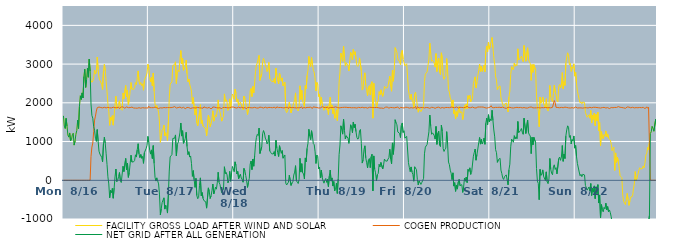
| Category | FACILITY GROSS LOAD AFTER WIND AND SOLAR | COGEN PRODUCTION | NET GRID AFTER ALL GENERATION |
|---|---|---|---|
|  Mon  8/16 | 1664 | 0 | 1664 |
|  Mon  8/16 | 1398 | 0 | 1398 |
|  Mon  8/16 | 1337 | 0 | 1337 |
|  Mon  8/16 | 1599 | 0 | 1599 |
|  Mon  8/16 | 1396 | 0 | 1396 |
|  Mon  8/16 | 1169 | 0 | 1169 |
|  Mon  8/16 | 1114 | 0 | 1114 |
|  Mon  8/16 | 1222 | 0 | 1222 |
|  Mon  8/16 | 1016 | 0 | 1016 |
|  Mon  8/16 | 1046 | 0 | 1046 |
|  Mon  8/16 | 1175 | 0 | 1175 |
|  Mon  8/16 | 1215 | 0 | 1215 |
|  Mon  8/16 | 908 | 0 | 908 |
|  Mon  8/16 | 1007 | 0 | 1007 |
|  Mon  8/16 | 1186 | 0 | 1186 |
|  Mon  8/16 | 1287 | 0 | 1287 |
|  Mon  8/16 | 1552 | 0 | 1552 |
|  Mon  8/16 | 1337 | 0 | 1337 |
|  Mon  8/16 | 1908 | 0 | 1908 |
|  Mon  8/16 | 2182 | 0 | 2182 |
|  Mon  8/16 | 2086 | 0 | 2086 |
|  Mon  8/16 | 2256 | 0 | 2256 |
|  Mon  8/16 | 2125 | 0 | 2125 |
|  Mon  8/16 | 2680 | 0 | 2680 |
|  Mon  8/16 | 2868 | 0 | 2868 |
|  Mon  8/16 | 2398 | 0 | 2398 |
|  Mon  8/16 | 2599 | 0 | 2599 |
|  Mon  8/16 | 2892 | 0 | 2892 |
|  Mon  8/16 | 2661 | 0 | 2661 |
|  Mon  8/16 | 3129 | 0 | 3129 |
|  Mon  8/16 | 2819 | 0 | 2819 |
|  Mon  8/16 | 2579 | 612 | 1967 |
|  Mon  8/16 | 2531 | 856 | 1675 |
|  Mon  8/16 | 2564 | 961 | 1603 |
|  Mon  8/16 | 2641 | 1258 | 1383 |
|  Mon  8/16 | 2846 | 1554 | 1292 |
|  Mon  8/16 | 2742 | 1656 | 1086 |
|  Mon  8/16 | 2792 | 1788 | 1004 |
|  Mon  8/16 | 3183 | 1874 | 1309 |
|  Mon  8/16 | 2863 | 1854 | 1009 |
|  Mon  8/16 | 2642 | 1891 | 751 |
|  Mon  8/16 | 2581 | 1903 | 678 |
|  Mon  8/16 | 2533 | 1878 | 655 |
|  Mon  8/16 | 2472 | 1879 | 593 |
|  Mon  8/16 | 2344 | 1869 | 475 |
|  Mon  8/16 | 2815 | 1876 | 939 |
|  Mon  8/16 | 2995 | 1884 | 1111 |
|  Mon  8/16 | 2829 | 1875 | 954 |
|  Mon  8/16 | 2552 | 1868 | 684 |
|  Mon  8/16 | 2295 | 1886 | 409 |
|  Mon  8/16 | 1973 | 1884 | 89 |
|  Mon  8/16 | 1780 | 1875 | -95 |
|  Mon  8/16 | 1418 | 1871 | -453 |
|  Mon  8/16 | 1626 | 1887 | -261 |
|  Mon  8/16 | 1552 | 1869 | -317 |
|  Mon  8/16 | 1668 | 1877 | -209 |
|  Mon  8/16 | 1423 | 1887 | -464 |
|  Mon  8/16 | 1684 | 1886 | -202 |
|  Mon  8/16 | 1960 | 1873 | 87 |
|  Mon  8/16 | 2172 | 1881 | 291 |
|  Mon  8/16 | 1839 | 1875 | -36 |
|  Mon  8/16 | 1879 | 1882 | -3 |
|  Mon  8/16 | 1985 | 1889 | 96 |
|  Mon  8/16 | 2052 | 1852 | 200 |
|  Mon  8/16 | 1866 | 1874 | -8 |
|  Mon  8/16 | 1834 | 1892 | -58 |
|  Mon  8/16 | 1807 | 1867 | -60 |
|  Mon  8/16 | 2255 | 1893 | 362 |
|  Mon  8/16 | 2099 | 1875 | 224 |
|  Mon  8/16 | 2083 | 1861 | 222 |
|  Mon  8/16 | 2445 | 1883 | 562 |
|  Mon  8/16 | 2159 | 1893 | 266 |
|  Mon  8/16 | 2320 | 1877 | 443 |
|  Mon  8/16 | 1950 | 1875 | 75 |
|  Mon  8/16 | 2085 | 1885 | 200 |
|  Mon  8/16 | 2298 | 1876 | 422 |
|  Mon  8/16 | 2523 | 1876 | 647 |
|  Mon  8/16 | 2360 | 1889 | 471 |
|  Mon  8/16 | 2331 | 1872 | 459 |
|  Mon  8/16 | 2345 | 1866 | 479 |
|  Mon  8/16 | 2389 | 1880 | 509 |
|  Mon  8/16 | 2522 | 1864 | 658 |
|  Mon  8/16 | 2469 | 1870 | 599 |
|  Mon  8/16 | 2651 | 1861 | 790 |
|  Mon  8/16 | 2824 | 1880 | 944 |
|  Mon  8/16 | 2554 | 1874 | 680 |
|  Mon  8/16 | 2472 | 1888 | 584 |
|  Mon  8/16 | 2526 | 1861 | 665 |
|  Mon  8/16 | 2445 | 1878 | 567 |
|  Mon  8/16 | 2491 | 1875 | 616 |
|  Mon  8/16 | 2326 | 1889 | 437 |
|  Mon  8/16 | 2580 | 1868 | 712 |
|  Mon  8/16 | 2565 | 1874 | 691 |
|  Mon  8/16 | 2692 | 1868 | 824 |
|  Mon  8/16 | 2769 | 1865 | 904 |
|  Mon  8/16 | 2998 | 1865 | 1133 |
|  Tue  8/17 | 2894 | 1912 | 982 |
|  Tue  8/17 | 2650 | 1875 | 775 |
|  Tue  8/17 | 2542 | 1866 | 676 |
|  Tue  8/17 | 2659 | 1875 | 784 |
|  Tue  8/17 | 2440 | 1879 | 561 |
|  Tue  8/17 | 2770 | 1874 | 896 |
|  Tue  8/17 | 2305 | 1871 | 434 |
|  Tue  8/17 | 1965 | 1890 | 75 |
|  Tue  8/17 | 1862 | 1882 | -20 |
|  Tue  8/17 | 1935 | 1872 | 63 |
|  Tue  8/17 | 1952 | 1868 | 84 |
|  Tue  8/17 | 1759 | 1853 | -94 |
|  Tue  8/17 | 1506 | 1864 | -358 |
|  Tue  8/17 | 980 | 1872 | -892 |
|  Tue  8/17 | 1140 | 1872 | -732 |
|  Tue  8/17 | 1293 | 1866 | -573 |
|  Tue  8/17 | 1331 | 1883 | -552 |
|  Tue  8/17 | 1425 | 1878 | -453 |
|  Tue  8/17 | 1145 | 1889 | -744 |
|  Tue  8/17 | 1230 | 1873 | -643 |
|  Tue  8/17 | 1180 | 1883 | -703 |
|  Tue  8/17 | 1030 | 1877 | -847 |
|  Tue  8/17 | 1502 | 1873 | -371 |
|  Tue  8/17 | 2115 | 1877 | 238 |
|  Tue  8/17 | 2484 | 1880 | 604 |
|  Tue  8/17 | 2508 | 1876 | 632 |
|  Tue  8/17 | 2540 | 1875 | 665 |
|  Tue  8/17 | 2964 | 1883 | 1081 |
|  Tue  8/17 | 2959 | 1867 | 1092 |
|  Tue  8/17 | 2988 | 1902 | 1086 |
|  Tue  8/17 | 3058 | 1887 | 1171 |
|  Tue  8/17 | 2496 | 1867 | 629 |
|  Tue  8/17 | 2811 | 1882 | 929 |
|  Tue  8/17 | 2846 | 1876 | 970 |
|  Tue  8/17 | 2801 | 1853 | 948 |
|  Tue  8/17 | 3113 | 1890 | 1223 |
|  Tue  8/17 | 3349 | 1870 | 1479 |
|  Tue  8/17 | 3006 | 1865 | 1141 |
|  Tue  8/17 | 3148 | 1868 | 1280 |
|  Tue  8/17 | 2839 | 1884 | 955 |
|  Tue  8/17 | 2873 | 1868 | 1005 |
|  Tue  8/17 | 2929 | 1849 | 1080 |
|  Tue  8/17 | 3102 | 1863 | 1239 |
|  Tue  8/17 | 2752 | 1881 | 871 |
|  Tue  8/17 | 2546 | 1882 | 664 |
|  Tue  8/17 | 2613 | 1876 | 737 |
|  Tue  8/17 | 2478 | 1879 | 599 |
|  Tue  8/17 | 2483 | 1855 | 628 |
|  Tue  8/17 | 2305 | 1874 | 431 |
|  Tue  8/17 | 1971 | 1870 | 101 |
|  Tue  8/17 | 2137 | 1887 | 250 |
|  Tue  8/17 | 1881 | 1871 | 10 |
|  Tue  8/17 | 1684 | 1867 | -183 |
|  Tue  8/17 | 1916 | 1867 | 49 |
|  Tue  8/17 | 1484 | 1878 | -394 |
|  Tue  8/17 | 1405 | 1882 | -477 |
|  Tue  8/17 | 1423 | 1871 | -448 |
|  Tue  8/17 | 1741 | 1871 | -130 |
|  Tue  8/17 | 1953 | 1891 | 62 |
|  Tue  8/17 | 1468 | 1867 | -399 |
|  Tue  8/17 | 1556 | 1873 | -317 |
|  Tue  8/17 | 1393 | 1862 | -469 |
|  Tue  8/17 | 1369 | 1895 | -526 |
|  Tue  8/17 | 1360 | 1882 | -522 |
|  Tue  8/17 | 1320 | 1875 | -555 |
|  Tue  8/17 | 1148 | 1868 | -720 |
|  Tue  8/17 | 1136 | 1866 | -730 |
|  Tue  8/17 | 1678 | 1874 | -196 |
|  Tue  8/17 | 1590 | 1883 | -293 |
|  Tue  8/17 | 1381 | 1852 | -471 |
|  Tue  8/17 | 1467 | 1872 | -405 |
|  Tue  8/17 | 1585 | 1855 | -270 |
|  Tue  8/17 | 1795 | 1892 | -97 |
|  Tue  8/17 | 1526 | 1880 | -354 |
|  Tue  8/17 | 1608 | 1887 | -279 |
|  Tue  8/17 | 1690 | 1868 | -178 |
|  Tue  8/17 | 1645 | 1875 | -230 |
|  Tue  8/17 | 1808 | 1875 | -67 |
|  Tue  8/17 | 2075 | 1868 | 207 |
|  Tue  8/17 | 1824 | 1877 | -53 |
|  Tue  8/17 | 1767 | 1873 | -106 |
|  Tue  8/17 | 1652 | 1875 | -223 |
|  Tue  8/17 | 1527 | 1849 | -322 |
|  Tue  8/17 | 1612 | 1877 | -265 |
|  Tue  8/17 | 1642 | 1879 | -237 |
|  Tue  8/17 | 2230 | 1881 | 349 |
|  Tue  8/17 | 2040 | 1869 | 171 |
|  Tue  8/17 | 2080 | 1877 | 203 |
|  Tue  8/17 | 2015 | 1877 | 138 |
|  Tue  8/17 | 1805 | 1869 | -64 |
|  Tue  8/17 | 1861 | 1870 | -9 |
|  Tue  8/17 | 2102 | 1873 | 229 |
|  Tue  8/17 | 1856 | 1881 | -25 |
|  Tue  8/17 | 2081 | 1890 | 191 |
|  Tue  8/17 | 2228 | 1871 | 357 |
|  Tue  8/17 | 2194 | 1892 | 302 |
|  Wed  8/18 | 2092 | 1869 | 223 |
|  Wed  8/18 | 2350 | 1874 | 476 |
|  Wed  8/18 | 2257 | 1872 | 385 |
|  Wed  8/18 | 2027 | 1865 | 162 |
|  Wed  8/18 | 2100 | 1872 | 228 |
|  Wed  8/18 | 1929 | 1890 | 39 |
|  Wed  8/18 | 1925 | 1884 | 41 |
|  Wed  8/18 | 2020 | 1865 | 155 |
|  Wed  8/18 | 1945 | 1891 | 54 |
|  Wed  8/18 | 1904 | 1885 | 19 |
|  Wed  8/18 | 1818 | 1868 | -50 |
|  Wed  8/18 | 2174 | 1868 | 306 |
|  Wed  8/18 | 2121 | 1875 | 246 |
|  Wed  8/18 | 2008 | 1886 | 122 |
|  Wed  8/18 | 1843 | 1849 | -6 |
|  Wed  8/18 | 1697 | 1881 | -184 |
|  Wed  8/18 | 1839 | 1892 | -53 |
|  Wed  8/18 | 1928 | 1878 | 50 |
|  Wed  8/18 | 2309 | 1894 | 415 |
|  Wed  8/18 | 2370 | 1872 | 498 |
|  Wed  8/18 | 2162 | 1887 | 275 |
|  Wed  8/18 | 2420 | 1871 | 549 |
|  Wed  8/18 | 2255 | 1892 | 363 |
|  Wed  8/18 | 2510 | 1883 | 627 |
|  Wed  8/18 | 2807 | 1876 | 931 |
|  Wed  8/18 | 2974 | 1868 | 1106 |
|  Wed  8/18 | 3030 | 1845 | 1185 |
|  Wed  8/18 | 3021 | 1865 | 1156 |
|  Wed  8/18 | 3225 | 1878 | 1347 |
|  Wed  8/18 | 2580 | 1889 | 691 |
|  Wed  8/18 | 2576 | 1888 | 688 |
|  Wed  8/18 | 2745 | 1880 | 865 |
|  Wed  8/18 | 3061 | 1863 | 1198 |
|  Wed  8/18 | 3149 | 1865 | 1284 |
|  Wed  8/18 | 3085 | 1864 | 1221 |
|  Wed  8/18 | 2976 | 1887 | 1089 |
|  Wed  8/18 | 2908 | 1868 | 1040 |
|  Wed  8/18 | 2805 | 1867 | 938 |
|  Wed  8/18 | 2867 | 1876 | 991 |
|  Wed  8/18 | 3045 | 1882 | 1163 |
|  Wed  8/18 | 2625 | 1866 | 759 |
|  Wed  8/18 | 2600 | 1878 | 722 |
|  Wed  8/18 | 2556 | 1870 | 686 |
|  Wed  8/18 | 2555 | 1873 | 682 |
|  Wed  8/18 | 2542 | 1864 | 678 |
|  Wed  8/18 | 2630 | 1886 | 744 |
|  Wed  8/18 | 2505 | 1880 | 625 |
|  Wed  8/18 | 2894 | 1860 | 1034 |
|  Wed  8/18 | 2722 | 1895 | 827 |
|  Wed  8/18 | 2591 | 1880 | 711 |
|  Wed  8/18 | 2489 | 1876 | 613 |
|  Wed  8/18 | 2768 | 1876 | 892 |
|  Wed  8/18 | 2668 | 1880 | 788 |
|  Wed  8/18 | 2559 | 1865 | 694 |
|  Wed  8/18 | 2644 | 1875 | 769 |
|  Wed  8/18 | 2438 | 1869 | 569 |
|  Wed  8/18 | 2436 | 1868 | 568 |
|  Wed  8/18 | 2532 | 1879 | 653 |
|  Wed  8/18 | 1809 | 1881 | -72 |
|  Wed  8/18 | 1747 | 1869 | -122 |
|  Wed  8/18 | 1787 | 1887 | -100 |
|  Wed  8/18 | 1799 | 1850 | -51 |
|  Wed  8/18 | 2018 | 1889 | 129 |
|  Wed  8/18 | 1997 | 1885 | 112 |
|  Wed  8/18 | 1743 | 1875 | -132 |
|  Wed  8/18 | 1823 | 1891 | -68 |
|  Wed  8/18 | 1839 | 1878 | -39 |
|  Wed  8/18 | 2001 | 1866 | 135 |
|  Wed  8/18 | 2083 | 1873 | 210 |
|  Wed  8/18 | 2256 | 1879 | 377 |
|  Wed  8/18 | 1860 | 1869 | -9 |
|  Wed  8/18 | 1817 | 1867 | -50 |
|  Wed  8/18 | 1789 | 1873 | -84 |
|  Wed  8/18 | 1893 | 1874 | 19 |
|  Wed  8/18 | 2440 | 1873 | 567 |
|  Wed  8/18 | 2086 | 1875 | 211 |
|  Wed  8/18 | 2324 | 1895 | 429 |
|  Wed  8/18 | 2045 | 1849 | 196 |
|  Wed  8/18 | 2044 | 1882 | 162 |
|  Wed  8/18 | 1898 | 1865 | 33 |
|  Wed  8/18 | 2446 | 1869 | 577 |
|  Wed  8/18 | 2361 | 1882 | 479 |
|  Wed  8/18 | 2705 | 1881 | 824 |
|  Wed  8/18 | 2837 | 1881 | 956 |
|  Wed  8/18 | 3198 | 1882 | 1316 |
|  Wed  8/18 | 3006 | 1867 | 1139 |
|  Wed  8/18 | 2936 | 1887 | 1049 |
|  Wed  8/18 | 3168 | 1889 | 1279 |
|  Wed  8/18 | 3000 | 1856 | 1144 |
|  Wed  8/18 | 2841 | 1896 | 945 |
|  Wed  8/18 | 2791 | 1873 | 918 |
|  Wed  8/18 | 2620 | 1885 | 735 |
|  Wed  8/18 | 2306 | 1872 | 434 |
|  Wed  8/18 | 2530 | 1879 | 651 |
|  Wed  8/18 | 2487 | 1875 | 612 |
|  Wed  8/18 | 2162 | 1867 | 295 |
|  Thu  8/19 | 2221 | 1878 | 343 |
|  Thu  8/19 | 1934 | 1870 | 64 |
|  Thu  8/19 | 2144 | 1882 | 262 |
|  Thu  8/19 | 1965 | 1897 | 68 |
|  Thu  8/19 | 1874 | 1889 | -15 |
|  Thu  8/19 | 1807 | 1882 | -75 |
|  Thu  8/19 | 1885 | 1882 | 3 |
|  Thu  8/19 | 1922 | 1876 | 46 |
|  Thu  8/19 | 1818 | 1870 | -52 |
|  Thu  8/19 | 1913 | 1887 | 26 |
|  Thu  8/19 | 1695 | 1860 | -165 |
|  Thu  8/19 | 1982 | 1874 | 108 |
|  Thu  8/19 | 2146 | 1881 | 265 |
|  Thu  8/19 | 1838 | 1858 | -20 |
|  Thu  8/19 | 1941 | 1880 | 61 |
|  Thu  8/19 | 1720 | 1869 | -149 |
|  Thu  8/19 | 1851 | 1882 | -31 |
|  Thu  8/19 | 1600 | 1877 | -277 |
|  Thu  8/19 | 1662 | 1895 | -233 |
|  Thu  8/19 | 1816 | 1891 | -75 |
|  Thu  8/19 | 1541 | 1881 | -340 |
|  Thu  8/19 | 1903 | 1869 | 34 |
|  Thu  8/19 | 2533 | 1868 | 665 |
|  Thu  8/19 | 2805 | 1892 | 913 |
|  Thu  8/19 | 3283 | 1877 | 1406 |
|  Thu  8/19 | 3175 | 1865 | 1310 |
|  Thu  8/19 | 3072 | 1881 | 1191 |
|  Thu  8/19 | 3461 | 1884 | 1577 |
|  Thu  8/19 | 3175 | 1884 | 1291 |
|  Thu  8/19 | 2947 | 1881 | 1066 |
|  Thu  8/19 | 3034 | 1884 | 1150 |
|  Thu  8/19 | 3009 | 1865 | 1144 |
|  Thu  8/19 | 2960 | 1876 | 1084 |
|  Thu  8/19 | 2827 | 1874 | 953 |
|  Thu  8/19 | 3089 | 1879 | 1210 |
|  Thu  8/19 | 3304 | 1871 | 1433 |
|  Thu  8/19 | 3230 | 1872 | 1358 |
|  Thu  8/19 | 3111 | 1884 | 1227 |
|  Thu  8/19 | 3379 | 1874 | 1505 |
|  Thu  8/19 | 3250 | 1891 | 1359 |
|  Thu  8/19 | 3318 | 1873 | 1445 |
|  Thu  8/19 | 3135 | 1879 | 1256 |
|  Thu  8/19 | 2971 | 1865 | 1106 |
|  Thu  8/19 | 2940 | 1879 | 1061 |
|  Thu  8/19 | 2974 | 1883 | 1091 |
|  Thu  8/19 | 3160 | 1879 | 1281 |
|  Thu  8/19 | 3185 | 1873 | 1312 |
|  Thu  8/19 | 2829 | 1876 | 953 |
|  Thu  8/19 | 2329 | 1885 | 444 |
|  Thu  8/19 | 2399 | 1871 | 528 |
|  Thu  8/19 | 2668 | 1870 | 798 |
|  Thu  8/19 | 2775 | 1885 | 890 |
|  Thu  8/19 | 2457 | 1878 | 579 |
|  Thu  8/19 | 2325 | 1874 | 451 |
|  Thu  8/19 | 2180 | 1863 | 317 |
|  Thu  8/19 | 2400 | 1881 | 519 |
|  Thu  8/19 | 2446 | 1884 | 562 |
|  Thu  8/19 | 2200 | 1874 | 326 |
|  Thu  8/19 | 2488 | 1882 | 606 |
|  Thu  8/19 | 2546 | 1873 | 673 |
|  Thu  8/19 | 1604 | 1877 | -273 |
|  Thu  8/19 | 2502 | 1873 | 629 |
|  Thu  8/19 | 2163 | 1877 | 286 |
|  Thu  8/19 | 2066 | 1873 | 193 |
|  Thu  8/19 | 1871 | 1880 | -9 |
|  Thu  8/19 | 2016 | 1873 | 143 |
|  Thu  8/19 | 2052 | 1875 | 177 |
|  Thu  8/19 | 2289 | 1880 | 409 |
|  Thu  8/19 | 2210 | 1864 | 346 |
|  Thu  8/19 | 2337 | 1875 | 462 |
|  Thu  8/19 | 2324 | 1865 | 459 |
|  Thu  8/19 | 2168 | 1877 | 291 |
|  Thu  8/19 | 2255 | 1856 | 399 |
|  Thu  8/19 | 2427 | 1878 | 549 |
|  Thu  8/19 | 2387 | 1885 | 502 |
|  Thu  8/19 | 2369 | 1883 | 486 |
|  Thu  8/19 | 2385 | 1892 | 493 |
|  Thu  8/19 | 2437 | 1887 | 550 |
|  Thu  8/19 | 2443 | 1863 | 580 |
|  Thu  8/19 | 2689 | 1887 | 802 |
|  Thu  8/19 | 2426 | 1881 | 545 |
|  Thu  8/19 | 2299 | 1875 | 424 |
|  Thu  8/19 | 2841 | 1876 | 965 |
|  Thu  8/19 | 2557 | 1888 | 669 |
|  Thu  8/19 | 2850 | 1869 | 981 |
|  Thu  8/19 | 3425 | 1861 | 1564 |
|  Thu  8/19 | 3362 | 1880 | 1482 |
|  Thu  8/19 | 3306 | 1872 | 1434 |
|  Thu  8/19 | 3137 | 1889 | 1248 |
|  Thu  8/19 | 3117 | 1866 | 1251 |
|  Thu  8/19 | 3060 | 1849 | 1211 |
|  Thu  8/19 | 2986 | 1883 | 1103 |
|  Thu  8/19 | 3300 | 1882 | 1418 |
|  Thu  8/19 | 3355 | 1875 | 1480 |
|  Thu  8/19 | 3124 | 1891 | 1233 |
|  Thu  8/19 | 3145 | 1866 | 1279 |
|  Fri  8/20 | 2956 | 1869 | 1087 |
|  Fri  8/20 | 2951 | 1887 | 1064 |
|  Fri  8/20 | 3009 | 1875 | 1134 |
|  Fri  8/20 | 3025 | 1881 | 1144 |
|  Fri  8/20 | 2331 | 1876 | 455 |
|  Fri  8/20 | 2191 | 1863 | 328 |
|  Fri  8/20 | 2089 | 1866 | 223 |
|  Fri  8/20 | 2220 | 1876 | 344 |
|  Fri  8/20 | 2076 | 1865 | 211 |
|  Fri  8/20 | 2014 | 1867 | 147 |
|  Fri  8/20 | 1859 | 1884 | -25 |
|  Fri  8/20 | 2227 | 1879 | 348 |
|  Fri  8/20 | 2278 | 1905 | 373 |
|  Fri  8/20 | 2111 | 1837 | 274 |
|  Fri  8/20 | 1914 | 1897 | 17 |
|  Fri  8/20 | 1758 | 1878 | -120 |
|  Fri  8/20 | 1853 | 1868 | -15 |
|  Fri  8/20 | 1835 | 1868 | -33 |
|  Fri  8/20 | 1771 | 1878 | -107 |
|  Fri  8/20 | 1813 | 1869 | -56 |
|  Fri  8/20 | 1872 | 1878 | -6 |
|  Fri  8/20 | 1932 | 1882 | 50 |
|  Fri  8/20 | 2551 | 1868 | 683 |
|  Fri  8/20 | 2740 | 1885 | 855 |
|  Fri  8/20 | 2716 | 1879 | 837 |
|  Fri  8/20 | 2800 | 1873 | 927 |
|  Fri  8/20 | 2969 | 1875 | 1094 |
|  Fri  8/20 | 3131 | 1880 | 1251 |
|  Fri  8/20 | 3542 | 1858 | 1684 |
|  Fri  8/20 | 3274 | 1868 | 1406 |
|  Fri  8/20 | 3071 | 1884 | 1187 |
|  Fri  8/20 | 3099 | 1874 | 1225 |
|  Fri  8/20 | 3073 | 1878 | 1195 |
|  Fri  8/20 | 3025 | 1874 | 1151 |
|  Fri  8/20 | 2922 | 1858 | 1064 |
|  Fri  8/20 | 3271 | 1881 | 1390 |
|  Fri  8/20 | 2808 | 1881 | 927 |
|  Fri  8/20 | 3083 | 1870 | 1213 |
|  Fri  8/20 | 3155 | 1887 | 1268 |
|  Fri  8/20 | 2791 | 1883 | 908 |
|  Fri  8/20 | 2729 | 1862 | 867 |
|  Fri  8/20 | 3291 | 1868 | 1423 |
|  Fri  8/20 | 3145 | 1880 | 1265 |
|  Fri  8/20 | 2691 | 1872 | 819 |
|  Fri  8/20 | 2608 | 1864 | 744 |
|  Fri  8/20 | 2671 | 1875 | 796 |
|  Fri  8/20 | 2709 | 1880 | 829 |
|  Fri  8/20 | 3143 | 1888 | 1255 |
|  Fri  8/20 | 2820 | 1879 | 941 |
|  Fri  8/20 | 2341 | 1871 | 470 |
|  Fri  8/20 | 2279 | 1874 | 405 |
|  Fri  8/20 | 2130 | 1869 | 261 |
|  Fri  8/20 | 2070 | 1889 | 181 |
|  Fri  8/20 | 1891 | 1874 | 17 |
|  Fri  8/20 | 2074 | 1882 | 192 |
|  Fri  8/20 | 1721 | 1871 | -150 |
|  Fri  8/20 | 1811 | 1873 | -62 |
|  Fri  8/20 | 1584 | 1870 | -286 |
|  Fri  8/20 | 1770 | 1892 | -122 |
|  Fri  8/20 | 1650 | 1878 | -228 |
|  Fri  8/20 | 1819 | 1865 | -46 |
|  Fri  8/20 | 1906 | 1884 | 22 |
|  Fri  8/20 | 1742 | 1883 | -141 |
|  Fri  8/20 | 1726 | 1878 | -152 |
|  Fri  8/20 | 1767 | 1880 | -113 |
|  Fri  8/20 | 1567 | 1880 | -313 |
|  Fri  8/20 | 1698 | 1875 | -177 |
|  Fri  8/20 | 1932 | 1880 | 52 |
|  Fri  8/20 | 1859 | 1882 | -23 |
|  Fri  8/20 | 1971 | 1891 | 80 |
|  Fri  8/20 | 1847 | 1907 | -60 |
|  Fri  8/20 | 2184 | 1905 | 279 |
|  Fri  8/20 | 2106 | 1874 | 232 |
|  Fri  8/20 | 2198 | 1876 | 322 |
|  Fri  8/20 | 2025 | 1874 | 151 |
|  Fri  8/20 | 2067 | 1864 | 203 |
|  Fri  8/20 | 2115 | 1891 | 224 |
|  Fri  8/20 | 2501 | 1881 | 620 |
|  Fri  8/20 | 2588 | 1870 | 718 |
|  Fri  8/20 | 2671 | 1864 | 807 |
|  Fri  8/20 | 2384 | 1866 | 518 |
|  Fri  8/20 | 2530 | 1865 | 665 |
|  Fri  8/20 | 2699 | 1891 | 808 |
|  Fri  8/20 | 2837 | 1868 | 969 |
|  Fri  8/20 | 2996 | 1891 | 1105 |
|  Fri  8/20 | 2810 | 1877 | 933 |
|  Fri  8/20 | 2946 | 1891 | 1055 |
|  Fri  8/20 | 2811 | 1875 | 936 |
|  Fri  8/20 | 2881 | 1890 | 991 |
|  Fri  8/20 | 2968 | 1879 | 1089 |
|  Fri  8/20 | 2803 | 1874 | 929 |
|  Fri  8/20 | 3345 | 1871 | 1474 |
|  Fri  8/20 | 3468 | 1864 | 1604 |
|  Fri  8/20 | 3316 | 1879 | 1437 |
|  Fri  8/20 | 3569 | 1876 | 1693 |
|  Fri  8/20 | 3386 | 1880 | 1506 |
|  Sat  8/21 | 3474 | 1891 | 1583 |
|  Sat  8/21 | 3466 | 1925 | 1541 |
|  Sat  8/21 | 3687 | 1879 | 1808 |
|  Sat  8/21 | 3421 | 1875 | 1546 |
|  Sat  8/21 | 3171 | 1873 | 1298 |
|  Sat  8/21 | 2994 | 1873 | 1121 |
|  Sat  8/21 | 2672 | 1882 | 790 |
|  Sat  8/21 | 2588 | 1877 | 711 |
|  Sat  8/21 | 2343 | 1880 | 463 |
|  Sat  8/21 | 2401 | 1874 | 527 |
|  Sat  8/21 | 2409 | 1885 | 524 |
|  Sat  8/21 | 2437 | 1869 | 568 |
|  Sat  8/21 | 2138 | 1876 | 262 |
|  Sat  8/21 | 2048 | 1875 | 173 |
|  Sat  8/21 | 1950 | 1889 | 61 |
|  Sat  8/21 | 1905 | 1883 | 22 |
|  Sat  8/21 | 1960 | 1869 | 91 |
|  Sat  8/21 | 1942 | 1871 | 71 |
|  Sat  8/21 | 1997 | 1857 | 140 |
|  Sat  8/21 | 2018 | 1871 | 147 |
|  Sat  8/21 | 1764 | 1882 | -118 |
|  Sat  8/21 | 2149 | 1879 | 270 |
|  Sat  8/21 | 2300 | 1884 | 416 |
|  Sat  8/21 | 2736 | 1871 | 865 |
|  Sat  8/21 | 2935 | 1871 | 1064 |
|  Sat  8/21 | 2931 | 1886 | 1045 |
|  Sat  8/21 | 2848 | 1866 | 982 |
|  Sat  8/21 | 3027 | 1875 | 1152 |
|  Sat  8/21 | 2944 | 1876 | 1068 |
|  Sat  8/21 | 2993 | 1870 | 1123 |
|  Sat  8/21 | 2958 | 1883 | 1075 |
|  Sat  8/21 | 3395 | 1878 | 1517 |
|  Sat  8/21 | 3106 | 1875 | 1231 |
|  Sat  8/21 | 3133 | 1886 | 1247 |
|  Sat  8/21 | 3164 | 1881 | 1283 |
|  Sat  8/21 | 3204 | 1867 | 1337 |
|  Sat  8/21 | 3109 | 1869 | 1240 |
|  Sat  8/21 | 3063 | 1875 | 1188 |
|  Sat  8/21 | 3480 | 1878 | 1602 |
|  Sat  8/21 | 3490 | 1881 | 1609 |
|  Sat  8/21 | 3075 | 1866 | 1209 |
|  Sat  8/21 | 3057 | 1871 | 1186 |
|  Sat  8/21 | 3420 | 1866 | 1554 |
|  Sat  8/21 | 3113 | 1885 | 1228 |
|  Sat  8/21 | 3057 | 1885 | 1172 |
|  Sat  8/21 | 3015 | 1872 | 1143 |
|  Sat  8/21 | 2580 | 1892 | 688 |
|  Sat  8/21 | 2988 | 1877 | 1111 |
|  Sat  8/21 | 2787 | 1870 | 917 |
|  Sat  8/21 | 2989 | 1879 | 1110 |
|  Sat  8/21 | 2980 | 1870 | 1110 |
|  Sat  8/21 | 2841 | 1870 | 971 |
|  Sat  8/21 | 2175 | 1871 | 304 |
|  Sat  8/21 | 1865 | 1886 | -21 |
|  Sat  8/21 | 1794 | 1876 | -82 |
|  Sat  8/21 | 1382 | 1884 | -502 |
|  Sat  8/21 | 2149 | 1867 | 282 |
|  Sat  8/21 | 1991 | 1864 | 127 |
|  Sat  8/21 | 2042 | 1876 | 166 |
|  Sat  8/21 | 2149 | 1881 | 268 |
|  Sat  8/21 | 1973 | 1873 | 100 |
|  Sat  8/21 | 1963 | 1863 | 100 |
|  Sat  8/21 | 1876 | 1880 | -4 |
|  Sat  8/21 | 2106 | 1889 | 217 |
|  Sat  8/21 | 1835 | 1872 | -37 |
|  Sat  8/21 | 1786 | 1874 | -88 |
|  Sat  8/21 | 1910 | 1875 | 35 |
|  Sat  8/21 | 2448 | 1885 | 563 |
|  Sat  8/21 | 2151 | 1871 | 280 |
|  Sat  8/21 | 2063 | 1882 | 181 |
|  Sat  8/21 | 2027 | 1884 | 143 |
|  Sat  8/21 | 2236 | 1891 | 345 |
|  Sat  8/21 | 2458 | 2059 | 399 |
|  Sat  8/21 | 2280 | 2001 | 279 |
|  Sat  8/21 | 2207 | 1881 | 326 |
|  Sat  8/21 | 2052 | 1886 | 166 |
|  Sat  8/21 | 2026 | 1878 | 148 |
|  Sat  8/21 | 2425 | 1867 | 558 |
|  Sat  8/21 | 2472 | 1872 | 600 |
|  Sat  8/21 | 2389 | 1874 | 515 |
|  Sat  8/21 | 2481 | 1882 | 599 |
|  Sat  8/21 | 2781 | 1884 | 897 |
|  Sat  8/21 | 2362 | 1873 | 489 |
|  Sat  8/21 | 2548 | 1872 | 676 |
|  Sat  8/21 | 2450 | 1889 | 561 |
|  Sat  8/21 | 3026 | 1885 | 1141 |
|  Sat  8/21 | 3182 | 1880 | 1302 |
|  Sat  8/21 | 3292 | 1886 | 1406 |
|  Sat  8/21 | 3239 | 1870 | 1369 |
|  Sat  8/21 | 2978 | 1870 | 1108 |
|  Sat  8/21 | 3023 | 1866 | 1157 |
|  Sat  8/21 | 2811 | 1874 | 937 |
|  Sat  8/21 | 2927 | 1875 | 1052 |
|  Sat  8/21 | 2897 | 1884 | 1013 |
|  Sat  8/21 | 3007 | 1863 | 1144 |
|  Sat  8/21 | 2689 | 1859 | 830 |
|  Sun  8/22 | 2790 | 1893 | 897 |
|  Sun  8/22 | 2490 | 1881 | 609 |
|  Sun  8/22 | 2299 | 1867 | 432 |
|  Sun  8/22 | 2315 | 1870 | 445 |
|  Sun  8/22 | 2084 | 1870 | 214 |
|  Sun  8/22 | 1997 | 1880 | 117 |
|  Sun  8/22 | 2023 | 1870 | 153 |
|  Sun  8/22 | 1973 | 1881 | 92 |
|  Sun  8/22 | 2019 | 1864 | 155 |
|  Sun  8/22 | 2042 | 1870 | 172 |
|  Sun  8/22 | 2010 | 1873 | 137 |
|  Sun  8/22 | 1749 | 1881 | -132 |
|  Sun  8/22 | 1761 | 1874 | -113 |
|  Sun  8/22 | 1627 | 1883 | -256 |
|  Sun  8/22 | 1633 | 1866 | -233 |
|  Sun  8/22 | 1691 | 1865 | -174 |
|  Sun  8/22 | 1605 | 1884 | -279 |
|  Sun  8/22 | 1800 | 1885 | -85 |
|  Sun  8/22 | 1478 | 1871 | -393 |
|  Sun  8/22 | 1682 | 1889 | -207 |
|  Sun  8/22 | 1576 | 1884 | -308 |
|  Sun  8/22 | 1736 | 1881 | -145 |
|  Sun  8/22 | 1409 | 1884 | -475 |
|  Sun  8/22 | 1704 | 1872 | -168 |
|  Sun  8/22 | 1530 | 1878 | -348 |
|  Sun  8/22 | 1760 | 1873 | -113 |
|  Sun  8/22 | 1284 | 1872 | -588 |
|  Sun  8/22 | 1490 | 1869 | -379 |
|  Sun  8/22 | 892 | 1865 | -973 |
|  Sun  8/22 | 1258 | 1885 | -627 |
|  Sun  8/22 | 1119 | 1877 | -758 |
|  Sun  8/22 | 1069 | 1884 | -815 |
|  Sun  8/22 | 1183 | 1882 | -699 |
|  Sun  8/22 | 1134 | 1874 | -740 |
|  Sun  8/22 | 1275 | 1866 | -591 |
|  Sun  8/22 | 1120 | 1885 | -765 |
|  Sun  8/22 | 1197 | 1876 | -679 |
|  Sun  8/22 | 1085 | 1901 | -816 |
|  Sun  8/22 | 1086 | 1852 | -766 |
|  Sun  8/22 | 1041 | 1877 | -836 |
|  Sun  8/22 | 933 | 1878 | -945 |
|  Sun  8/22 | 764 | 1876 | -1112 |
|  Sun  8/22 | 820 | 1873 | -1053 |
|  Sun  8/22 | 856 | 1875 | -1019 |
|  Sun  8/22 | 253 | 1881 | -1628 |
|  Sun  8/22 | 707 | 1859 | -1152 |
|  Sun  8/22 | 462 | 1880 | -1418 |
|  Sun  8/22 | 594 | 1879 | -1285 |
|  Sun  8/22 | 488 | 1902 | -1414 |
|  Sun  8/22 | 309 | 1881 | -1572 |
|  Sun  8/22 | 115 | 1884 | -1769 |
|  Sun  8/22 | 124 | 1903 | -1779 |
|  Sun  8/22 | 68 | 1879 | -1811 |
|  Sun  8/22 | -392 | 1884 | -2276 |
|  Sun  8/22 | -541 | 1870 | -2411 |
|  Sun  8/22 | -559 | 1851 | -2410 |
|  Sun  8/22 | -628 | 1858 | -2486 |
|  Sun  8/22 | -621 | 1879 | -2500 |
|  Sun  8/22 | -340 | 1893 | -2233 |
|  Sun  8/22 | -497 | 1876 | -2373 |
|  Sun  8/22 | -648 | 1888 | -2536 |
|  Sun  8/22 | -530 | 1871 | -2401 |
|  Sun  8/22 | -433 | 1871 | -2304 |
|  Sun  8/22 | -421 | 1890 | -2311 |
|  Sun  8/22 | -413 | 1884 | -2297 |
|  Sun  8/22 | -226 | 1895 | -2121 |
|  Sun  8/22 | -96 | 1869 | -1965 |
|  Sun  8/22 | 224 | 1885 | -1661 |
|  Sun  8/22 | -4 | 1876 | -1880 |
|  Sun  8/22 | 51 | 1874 | -1823 |
|  Sun  8/22 | 72 | 1873 | -1801 |
|  Sun  8/22 | 247 | 1878 | -1631 |
|  Sun  8/22 | 323 | 1879 | -1556 |
|  Sun  8/22 | 293 | 1869 | -1576 |
|  Sun  8/22 | 316 | 1874 | -1558 |
|  Sun  8/22 | 300 | 1876 | -1576 |
|  Sun  8/22 | 371 | 1885 | -1514 |
|  Sun  8/22 | 316 | 1859 | -1543 |
|  Sun  8/22 | 456 | 1872 | -1416 |
|  Sun  8/22 | 649 | 1863 | -1214 |
|  Sun  8/22 | 700 | 1896 | -1196 |
|  Sun  8/22 | 845 | 1860 | -1015 |
|  Sun  8/22 | 783 | 1887 | -1104 |
|  Sun  8/22 | 982 | 1886 | -904 |
|  Sun  8/22 | 1206 | 0 | 1206 |
|  Sun  8/22 | 1253 | 0 | 1253 |
|  Sun  8/22 | 1394 | 0 | 1394 |
|  Sun  8/22 | 1341 | 0 | 1341 |
|  Sun  8/22 | 1266 | 0 | 1266 |
|  Sun  8/22 | 1262 | 0 | 1262 |
|  Sun  8/22 | 1572 | 0 | 1572 |
|  Sun  8/22 | 1428 | 0 | 1428 |